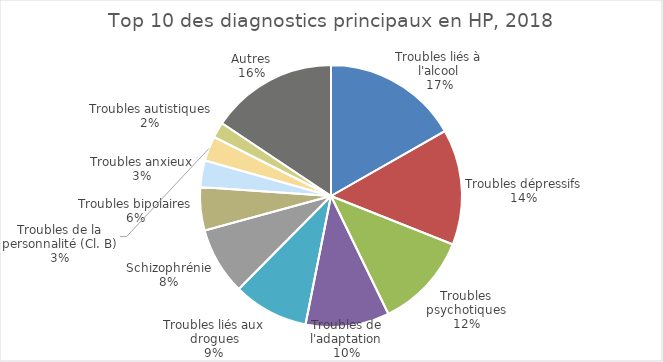
| Category | Fréquence |
|---|---|
| Troubles liés à l'alcool | 8557 |
| Troubles dépressifs | 7289 |
| Troubles psychotiques | 6016 |
| Troubles de l'adaptation | 5274 |
| Troubles liés aux drogues | 4757 |
| Schizophrénie | 4249 |
| Troubles bipolaires | 2730 |
| Troubles anxieux | 1669 |
| Troubles de la personnalité (Cl. B) | 1573 |
| Troubles autistiques | 985 |
| Autres | 7987 |